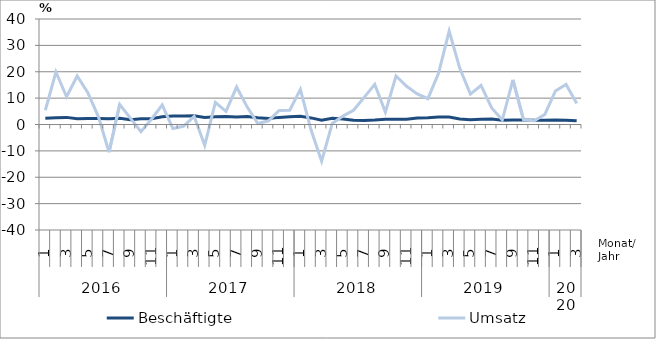
| Category | Beschäftigte | Umsatz |
|---|---|---|
| 0 | 2.4 | 5.4 |
| 1 | 2.6 | 19.9 |
| 2 | 2.7 | 10.5 |
| 3 | 2.2 | 18.4 |
| 4 | 2.3 | 12.1 |
| 5 | 2.3 | 2.9 |
| 6 | 2.2 | -10.5 |
| 7 | 2.4 | 7.6 |
| 8 | 1.8 | 2.4 |
| 9 | 2.2 | -2.7 |
| 10 | 2.2 | 2.1 |
| 11 | 2.9 | 7.4 |
| 12 | 3.2 | -1.5 |
| 13 | 3.2 | -0.7 |
| 14 | 3.3 | 3.1 |
| 15 | 2.7 | -7.9 |
| 16 | 2.9 | 8.4 |
| 17 | 3 | 5 |
| 18 | 2.8 | 14.2 |
| 19 | 3 | 6.6 |
| 20 | 2.6 | 0.4 |
| 21 | 2.3 | 1.4 |
| 22 | 2.7 | 5.3 |
| 23 | 2.9 | 5.4 |
| 24 | 3.1 | 13.3 |
| 25 | 2.5 | -2 |
| 26 | 1.6 | -13.9 |
| 27 | 2.4 | 0.4 |
| 28 | 2.1 | 3.2 |
| 29 | 1.6 | 5.4 |
| 30 | 1.5 | 10.3 |
| 31 | 1.7 | 15.2 |
| 32 | 2 | 4.7 |
| 33 | 2 | 18.4 |
| 34 | 2 | 14.5 |
| 35 | 2.5 | 11.6 |
| 36 | 2.6 | 9.8 |
| 37 | 2.8 | 19.4 |
| 38 | 2.8 | 35.4 |
| 39 | 2.1 | 21.3 |
| 40 | 1.8 | 11.5 |
| 41 | 2 | 14.8 |
| 42 | 2.1 | 6.3 |
| 43 | 1.6 | 1.7 |
| 44 | 1.7 | 16.9 |
| 45 | 1.7 | 1.8 |
| 46 | 1.6 | 1.4 |
| 47 | 1.6 | 3.8 |
| 48 | 1.7 | 12.7 |
| 49 | 1.6 | 15.2 |
| 50 | 1.4 | 8 |